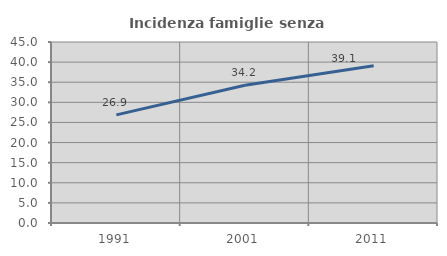
| Category | Incidenza famiglie senza nuclei |
|---|---|
| 1991.0 | 26.891 |
| 2001.0 | 34.233 |
| 2011.0 | 39.105 |